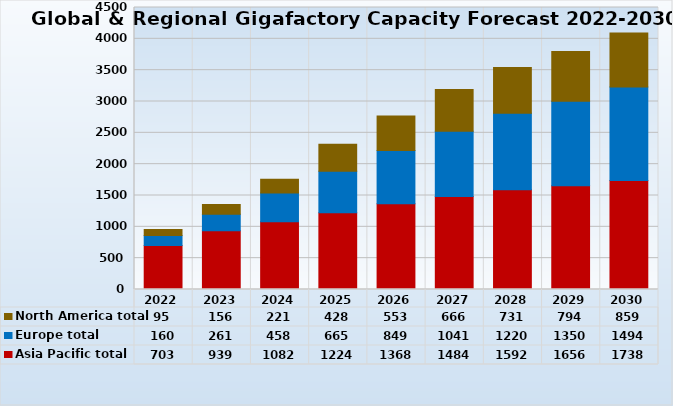
| Category | Asia Pacific total | Europe total | North America total |
|---|---|---|---|
| 2022.0 | 703.33 | 159.955 | 95.3 |
| 2023.0 | 939.2 | 260.95 | 156.1 |
| 2024.0 | 1081.8 | 458.35 | 221.1 |
| 2025.0 | 1223.5 | 665.15 | 428.1 |
| 2026.0 | 1367.6 | 849.15 | 552.8 |
| 2027.0 | 1483.7 | 1040.95 | 665.8 |
| 2028.0 | 1591.9 | 1219.75 | 730.8 |
| 2029.0 | 1655.5 | 1349.65 | 793.8 |
| 2030.0 | 1738.1 | 1494.45 | 858.8 |